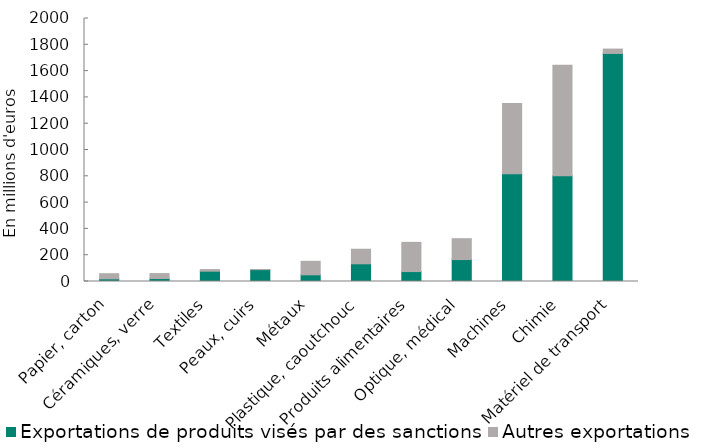
| Category | Exportations de produits visés par des sanctions | Autres exportations  |
|---|---|---|
| Papier, carton | 20.066 | 39.16 |
| Céramiques, verre | 22.888 | 37.312 |
| Textiles | 78.41 | 12.461 |
| Peaux, cuirs | 90.178 | 0.814 |
| Métaux | 50.654 | 102.823 |
| Plastique, caoutchouc | 134.491 | 110.686 |
| Produits alimentaires | 75.513 | 222.086 |
| Optique, médical | 166.756 | 158.91 |
| Machines | 818.849 | 535.599 |
| Chimie | 804.806 | 838.926 |
| Matériel de transport | 1734.263 | 33.278 |